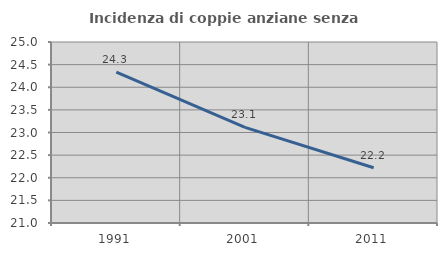
| Category | Incidenza di coppie anziane senza figli  |
|---|---|
| 1991.0 | 24.336 |
| 2001.0 | 23.113 |
| 2011.0 | 22.222 |